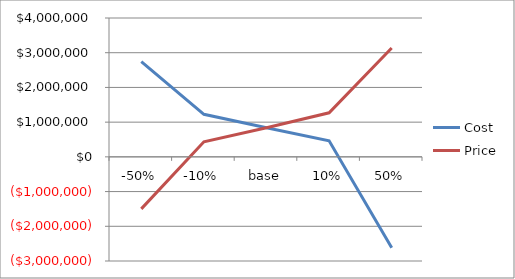
| Category | Cost | Price |
|---|---|---|
| -50% | 2745030.482 | -1498544.84 |
| -10% | 1224997.917 | 433660.017 |
| base | 840989.69 | 840989.69 |
| 10% | 464981.634 | 1269208.063 |
| 50% | -2615084.354 | 3133524.642 |